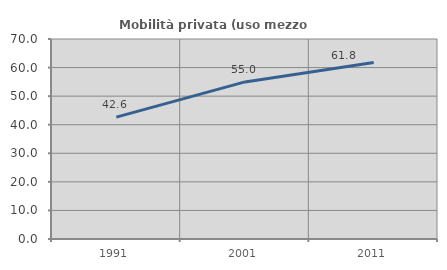
| Category | Mobilità privata (uso mezzo privato) |
|---|---|
| 1991.0 | 42.644 |
| 2001.0 | 54.985 |
| 2011.0 | 61.8 |